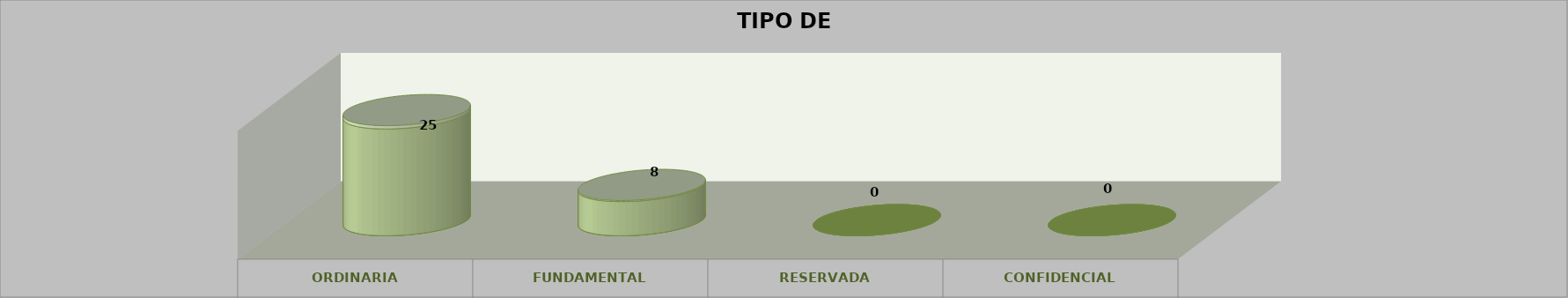
| Category | Series 0 | Series 2 | Series 1 | Series 3 | Series 4 |
|---|---|---|---|---|---|
| 0 |  |  |  | 25 | 0.758 |
| 1 |  |  |  | 8 | 0.242 |
| 2 |  |  |  | 0 | 0 |
| 3 |  |  |  | 0 | 0 |